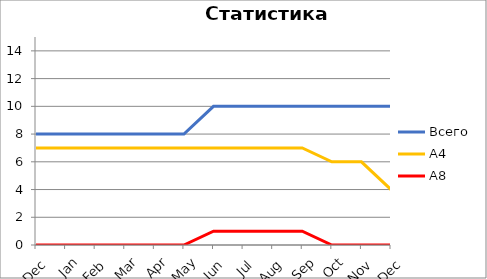
| Category | Всего | А4 | A8 |
|---|---|---|---|
| 0 | 8 | 7 | 0 |
| 1 | 8 | 7 | 0 |
| 2 | 8 | 7 | 0 |
| 3 | 8 | 7 | 0 |
| 4 | 8 | 7 | 0 |
| 5 | 8 | 7 | 0 |
| 6 | 10 | 7 | 1 |
| 7 | 10 | 7 | 1 |
| 8 | 10 | 7 | 1 |
| 9 | 10 | 7 | 1 |
| 10 | 10 | 6 | 0 |
| 11 | 10 | 6 | 0 |
| 12 | 10 | 4 | 0 |